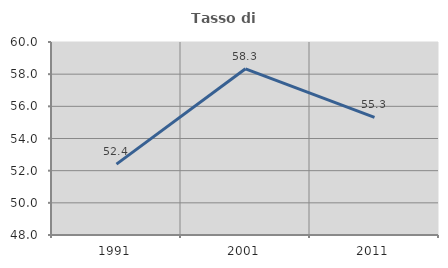
| Category | Tasso di occupazione   |
|---|---|
| 1991.0 | 52.404 |
| 2001.0 | 58.333 |
| 2011.0 | 55.317 |